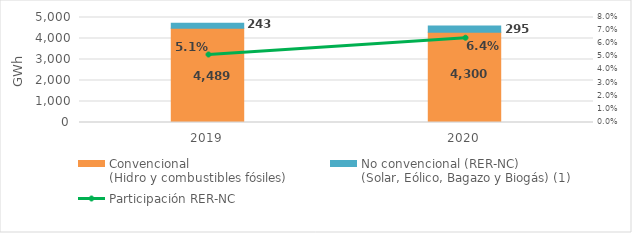
| Category | Convencional
(Hidro y combustibles fósiles) | No convencional (RER-NC)
(Solar, Eólico, Bagazo y Biogás) (1) |
|---|---|---|
| 2019.0 | 4488.687 | 243.356 |
| 2020.0 | 4299.705 | 294.993 |